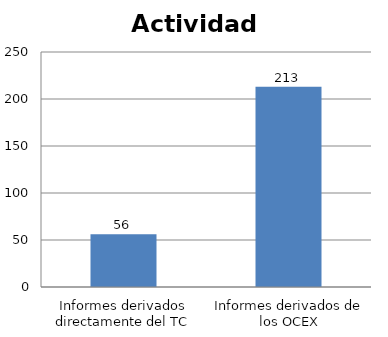
| Category | Series 0 |
|---|---|
| Informes derivados directamente del TC | 56 |
| Informes derivados de los OCEX | 213 |